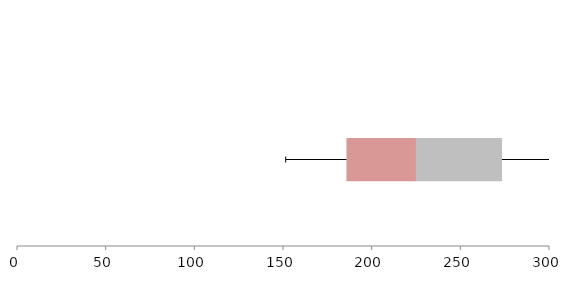
| Category | Series 1 | Series 2 | Series 3 |
|---|---|---|---|
| 0 | 185.78 | 39.195 | 48.536 |